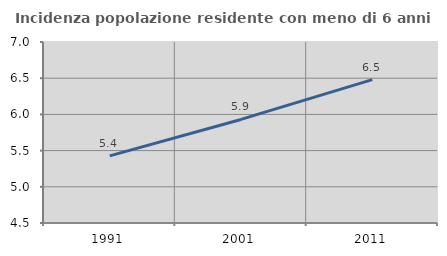
| Category | Incidenza popolazione residente con meno di 6 anni |
|---|---|
| 1991.0 | 5.427 |
| 2001.0 | 5.93 |
| 2011.0 | 6.48 |